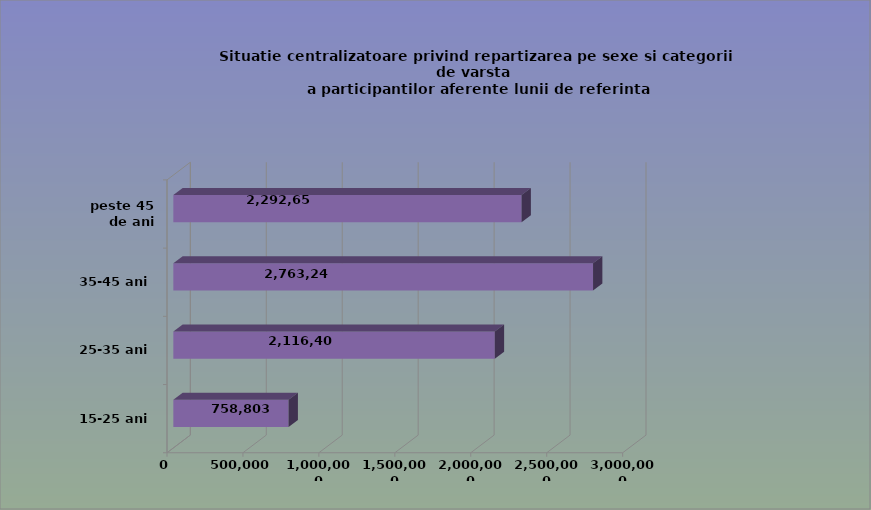
| Category | 15-25 ani 25-35 ani 35-45 ani peste 45 de ani |
|---|---|
| 15-25 ani | 758803 |
| 25-35 ani | 2116401 |
| 35-45 ani | 2763248 |
| peste 45 de ani | 2292659 |